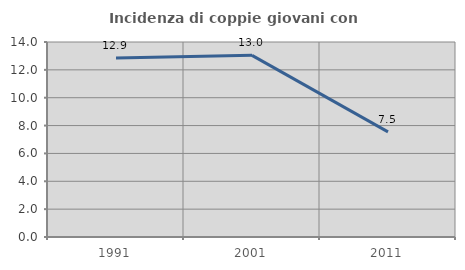
| Category | Incidenza di coppie giovani con figli |
|---|---|
| 1991.0 | 12.857 |
| 2001.0 | 13.043 |
| 2011.0 | 7.547 |